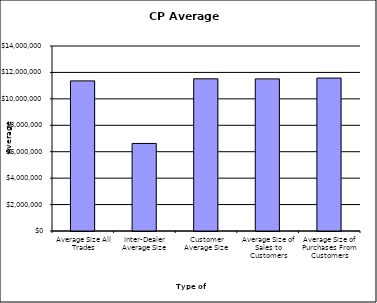
| Category | Security Type |
|---|---|
| Average Size All Trades | 11360242.9 |
| Inter-Dealer Average Size | 6626255.814 |
| Customer Average Size | 11517433.205 |
| Average Size of Sales to Customers | 11511956.743 |
| Average Size of Purchases From Customers | 11573094.828 |